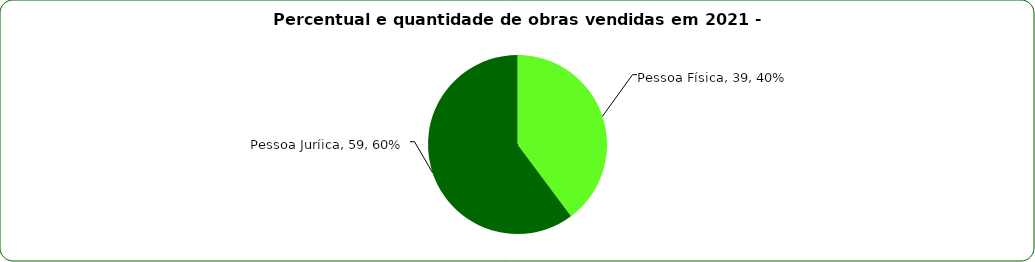
| Category | Series 0 |
|---|---|
| Pessoa Física | 39 |
| Pessoa Juríica | 59 |